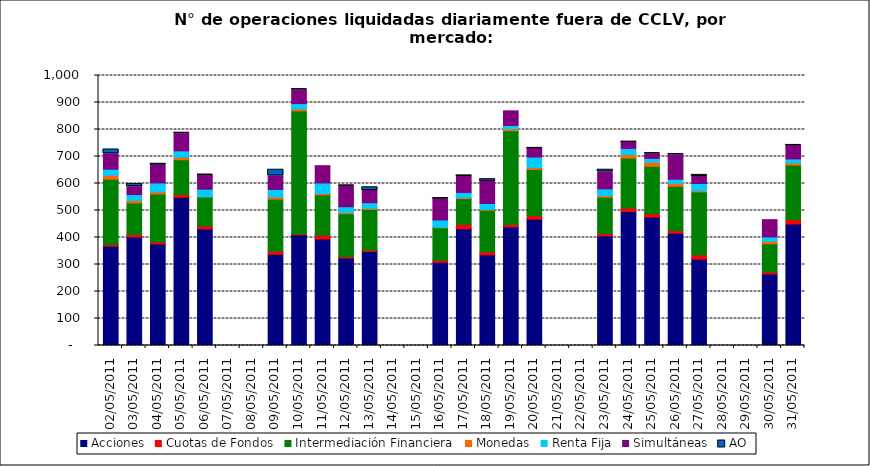
| Category | Acciones | Cuotas de Fondos | Intermediación Financiera | Monedas | Renta Fija | Simultáneas | AO |
|---|---|---|---|---|---|---|---|
| 02/05/2011 | 368 | 6 | 242 | 14 | 23 | 57 | 16 |
| 03/05/2011 | 402 | 9 | 117 | 9 | 22 | 29 | 10 |
| 04/05/2011 | 376 | 7 | 178 | 8 | 33 | 66 | 5 |
| 05/05/2011 | 549 | 10 | 129 | 9 | 24 | 64 | 3 |
| 06/05/2011 | 432 | 11 | 107 | 1 | 28 | 52 | 1 |
| 09/05/2011 | 338 | 11 | 193 | 8 | 28 | 50 | 23 |
| 10/05/2011 | 410 | 3 | 456 | 7 | 20 | 51 | 2 |
| 11/05/2011 | 395 | 14 | 149 | 5 | 39 | 64 | 0 |
| 12/05/2011 | 324 | 5 | 159 | 4 | 22 | 77 | 1 |
| 13/05/2011 | 348 | 5 | 151 | 4 | 21 | 45 | 12 |
| 16/05/2011 | 308 | 8 | 120 | 2 | 27 | 77 | 4 |
| 17/05/2011 | 433 | 16 | 95 | 3 | 20 | 59 | 4 |
| 18/05/2011 | 336 | 11 | 154 | 3 | 22 | 82 | 8 |
| 19/05/2011 | 439 | 9 | 347 | 7 | 13 | 54 | 0 |
| 20/05/2011 | 468 | 13 | 171 | 7 | 39 | 32 | 1 |
| 23/05/2011 | 406 | 9 | 134 | 6 | 25 | 63 | 8 |
| 24/05/2011 | 496 | 12 | 186 | 13 | 23 | 22 | 3 |
| 25/05/2011 | 476 | 12 | 176 | 15 | 14 | 17 | 2 |
| 26/05/2011 | 416 | 9 | 165 | 11 | 15 | 90 | 3 |
| 27/05/2011 | 320 | 15 | 234 | 4 | 27 | 26 | 6 |
| 30/05/2011 | 265 | 7 | 105 | 9 | 16 | 64 | 0 |
| 31/05/2011 | 450 | 16 | 202 | 8 | 15 | 50 | 1 |